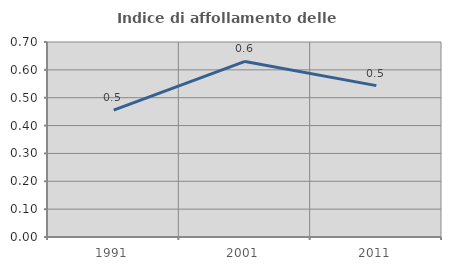
| Category | Indice di affollamento delle abitazioni  |
|---|---|
| 1991.0 | 0.456 |
| 2001.0 | 0.63 |
| 2011.0 | 0.543 |